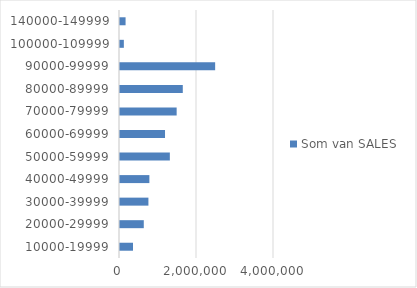
| Category | Totaal |
|---|---|
| 10000-19999 | 337210 |
| 20000-29999 | 617761 |
| 30000-39999 | 738087 |
| 40000-49999 | 763158 |
| 50000-59999 | 1294673 |
| 60000-69999 | 1169269 |
| 70000-79999 | 1471589 |
| 80000-89999 | 1630864 |
| 90000-99999 | 2471446 |
| 100000-109999 | 100000 |
| 140000-149999 | 144719 |